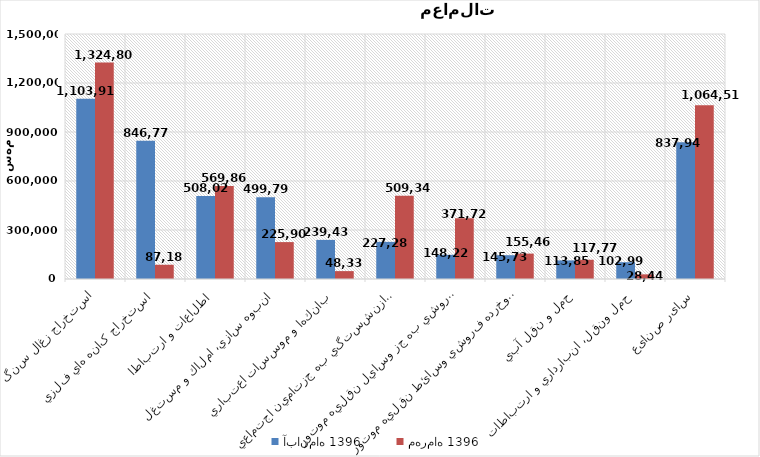
| Category | آبان‌ماه 1396 | مهرماه 1396 |
|---|---|---|
| استخراج زغال سنگ | 1103910.465 | 1324806.66 |
| استخراج کانه هاي فلزي | 846777.553 | 87185.966 |
| اطلاعات و ارتباطات | 508022.045 | 569861.256 |
| انبوه سازي، املاك و مستغلات | 499797.263 | 225908.988 |
| بانكها و موسسات اعتباري | 239438.416 | 48330.483 |
| بيمه وصندوق بازنشستگي به جزتامين اجتماعي | 227285.187 | 509345.054 |
| تجارت عمده فروشي به جز وسايل نقليه موتور | 148221.243 | 371725.517 |
| تجارت عمده وخرده فروشي وسائط نقليه موتور | 145733.014 | 155462.785 |
| حمل و نقل آبي | 113855.445 | 117775.204 |
| حمل ونقل، انبارداري و ارتباطات | 102994.878 | 28441.181 |
| سایر صنایع | 837942.573 | 1064516.204 |